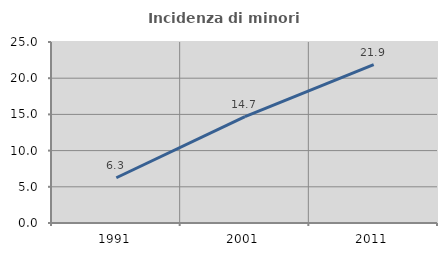
| Category | Incidenza di minori stranieri |
|---|---|
| 1991.0 | 6.25 |
| 2001.0 | 14.679 |
| 2011.0 | 21.886 |